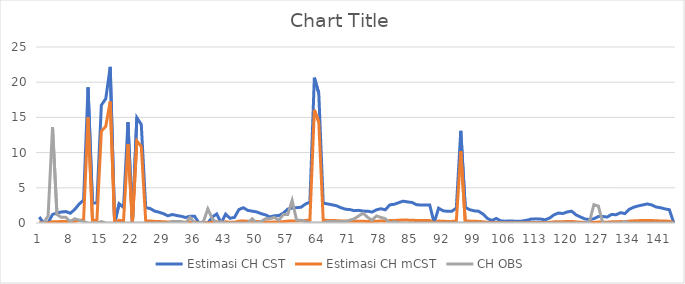
| Category | Estimasi CH CST | Estimasi CH mCST | CH OBS |
|---|---|---|---|
| 0 | 0.851 | 0.116 | 0 |
| 1 | 0 | 0 | 0 |
| 2 | 0 | 0 | 1 |
| 3 | 1.222 | 0.167 | 13.6 |
| 4 | 1.418 | 0.194 | 1.2 |
| 5 | 1.562 | 0.214 | 0.8 |
| 6 | 1.614 | 0.221 | 0.8 |
| 7 | 1.382 | 0.189 | 0.2 |
| 8 | 1.921 | 0.263 | 0.6 |
| 9 | 2.697 | 0.369 | 0.4 |
| 10 | 3.264 | 0.447 | 0.2 |
| 11 | 19.258 | 14.987 | 0 |
| 12 | 2.799 | 0.383 | 0 |
| 13 | 2.884 | 0.395 | 0 |
| 14 | 16.731 | 13.021 | 0.2 |
| 15 | 17.654 | 13.739 | 0 |
| 16 | 22.176 | 17.258 | 0 |
| 17 | 0 | 0 | 0 |
| 18 | 2.727 | 0.373 | 0 |
| 19 | 2.206 | 0.302 | 0 |
| 20 | 14.338 | 11.158 | 0 |
| 21 | 0 | 0 | 0 |
| 22 | 14.97 | 11.65 | 0 |
| 23 | 13.986 | 10.885 | 0 |
| 24 | 2.177 | 0.298 | 0 |
| 25 | 2.057 | 0.281 | 0 |
| 26 | 1.689 | 0.231 | 0 |
| 27 | 1.534 | 0.21 | 0 |
| 28 | 1.328 | 0.182 | 0 |
| 29 | 1.021 | 0.14 | 0 |
| 30 | 1.209 | 0.165 | 0.2 |
| 31 | 1.061 | 0.145 | 0.2 |
| 32 | 0.955 | 0.131 | 0.2 |
| 33 | 0.782 | 0.107 | 0 |
| 34 | 0.97 | 0.133 | 0.8 |
| 35 | 0.97 | 0.133 | 0 |
| 36 | 0 | 0 | 0 |
| 37 | 0 | 0 | 0.2 |
| 38 | 0 | 0 | 2 |
| 39 | 0.844 | 0.116 | 0.6 |
| 40 | 1.284 | 0.176 | 0 |
| 41 | 0 | 0 | 0.2 |
| 42 | 1.256 | 0.172 | 0 |
| 43 | 0.669 | 0.092 | 0 |
| 44 | 0.792 | 0.108 | 0 |
| 45 | 1.909 | 0.261 | 0 |
| 46 | 2.17 | 0.297 | 0 |
| 47 | 1.792 | 0.245 | 0 |
| 48 | 1.684 | 0.23 | 0.6 |
| 49 | 1.571 | 0.215 | 0 |
| 50 | 1.328 | 0.182 | 0.2 |
| 51 | 1.152 | 0.158 | 0.6 |
| 52 | 0.857 | 0.117 | 0.6 |
| 53 | 1.034 | 0.141 | 0.8 |
| 54 | 1.061 | 0.145 | 0.4 |
| 55 | 1.402 | 0.192 | 1.2 |
| 56 | 1.971 | 0.27 | 1.2 |
| 57 | 2.126 | 0.291 | 3.2 |
| 58 | 2.184 | 0.299 | 0.4 |
| 59 | 2.237 | 0.306 | 0.4 |
| 60 | 2.697 | 0.369 | 0.2 |
| 61 | 2.962 | 0.405 | 0 |
| 62 | 20.643 | 16.065 | 0 |
| 63 | 18.432 | 14.344 | 0 |
| 64 | 2.82 | 0.386 | 0 |
| 65 | 2.707 | 0.37 | 0.2 |
| 66 | 2.582 | 0.353 | 0.2 |
| 67 | 2.448 | 0.335 | 0.2 |
| 68 | 2.17 | 0.297 | 0.2 |
| 69 | 1.959 | 0.268 | 0.2 |
| 70 | 1.909 | 0.261 | 0.4 |
| 71 | 1.753 | 0.24 | 0.6 |
| 72 | 1.797 | 0.246 | 1 |
| 73 | 1.689 | 0.231 | 1.4 |
| 74 | 1.679 | 0.23 | 0.8 |
| 75 | 1.552 | 0.212 | 0.4 |
| 76 | 1.879 | 0.257 | 1 |
| 77 | 2.023 | 0.277 | 0.8 |
| 78 | 1.879 | 0.257 | 0.6 |
| 79 | 2.573 | 0.352 | 0 |
| 80 | 2.658 | 0.364 | 0.2 |
| 81 | 2.884 | 0.395 | 0 |
| 82 | 3.102 | 0.424 | 0 |
| 83 | 2.996 | 0.41 | 0 |
| 84 | 2.917 | 0.399 | 0 |
| 85 | 2.601 | 0.356 | 0 |
| 86 | 2.554 | 0.35 | 0 |
| 87 | 2.573 | 0.352 | 0 |
| 88 | 2.564 | 0.351 | 0 |
| 89 | 0 | 0 | 0 |
| 90 | 2.105 | 0.288 | 0 |
| 91 | 1.737 | 0.238 | 0 |
| 92 | 1.654 | 0.226 | 0 |
| 93 | 1.674 | 0.229 | 0 |
| 94 | 2.126 | 0.291 | 0 |
| 95 | 13.091 | 10.188 | 0 |
| 96 | 2.229 | 0.305 | 0 |
| 97 | 1.891 | 0.259 | 0 |
| 98 | 1.726 | 0.236 | 0 |
| 99 | 1.674 | 0.229 | 0 |
| 100 | 1.27 | 0.174 | 0 |
| 101 | 0.638 | 0.087 | 0 |
| 102 | 0.364 | 0.05 | 0 |
| 103 | 0.644 | 0.088 | 0 |
| 104 | 0.306 | 0.042 | 0 |
| 105 | 0.256 | 0.035 | 0 |
| 106 | 0.298 | 0.041 | 0 |
| 107 | 0.263 | 0.036 | 0 |
| 108 | 0.231 | 0.032 | 0 |
| 109 | 0.292 | 0.04 | 0 |
| 110 | 0.416 | 0.057 | 0 |
| 111 | 0.578 | 0.079 | 0 |
| 112 | 0.588 | 0.081 | 0 |
| 113 | 0.561 | 0.077 | 0 |
| 114 | 0.449 | 0.061 | 0 |
| 115 | 0.693 | 0.095 | 0 |
| 116 | 1.155 | 0.158 | 0 |
| 117 | 1.414 | 0.193 | 0 |
| 118 | 1.347 | 0.184 | 0 |
| 119 | 1.571 | 0.215 | 0 |
| 120 | 1.674 | 0.229 | 0 |
| 121 | 1.139 | 0.156 | 0 |
| 122 | 0.849 | 0.116 | 0 |
| 123 | 0.568 | 0.078 | 0 |
| 124 | 0.49 | 0.067 | 0.2 |
| 125 | 0.607 | 0.083 | 2.6 |
| 126 | 0.927 | 0.127 | 2.4 |
| 127 | 0.927 | 0.127 | 0 |
| 128 | 0.847 | 0.116 | 0 |
| 129 | 1.219 | 0.167 | 0 |
| 130 | 1.17 | 0.16 | 0 |
| 131 | 1.468 | 0.201 | 0 |
| 132 | 1.332 | 0.182 | 0.2 |
| 133 | 1.959 | 0.268 | 0 |
| 134 | 2.244 | 0.307 | 0 |
| 135 | 2.43 | 0.333 | 0 |
| 136 | 2.564 | 0.351 | 0 |
| 137 | 2.707 | 0.37 | 0 |
| 138 | 2.573 | 0.352 | 0 |
| 139 | 2.275 | 0.311 | 0 |
| 140 | 2.17 | 0.297 | 0 |
| 141 | 2.004 | 0.274 | 0 |
| 142 | 1.885 | 0.258 | 0 |
| 143 | 0 | 0 | 0 |